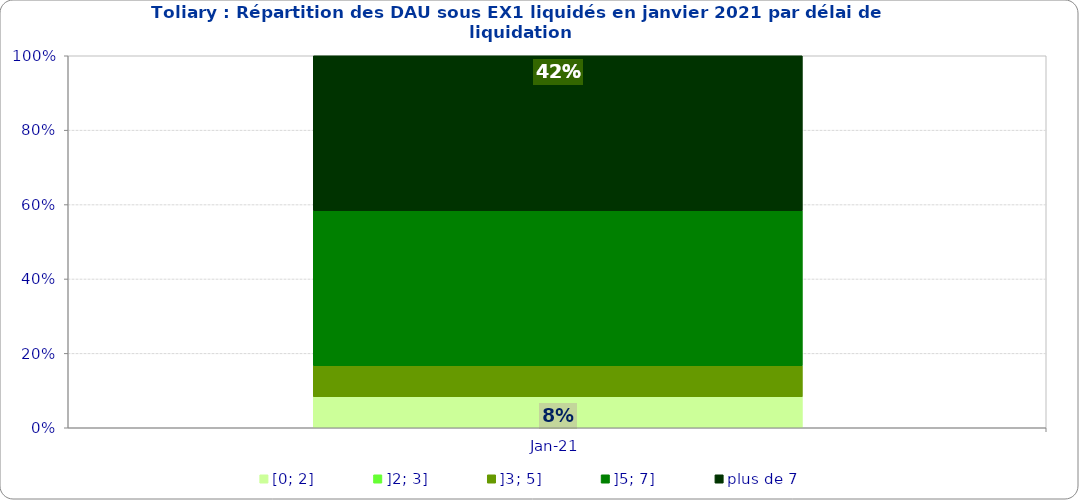
| Category | [0; 2] | ]2; 3] | ]3; 5] | ]5; 7] | plus de 7 |
|---|---|---|---|---|---|
| 2021-01-01 | 0.083 | 0 | 0.083 | 0.417 | 0.417 |